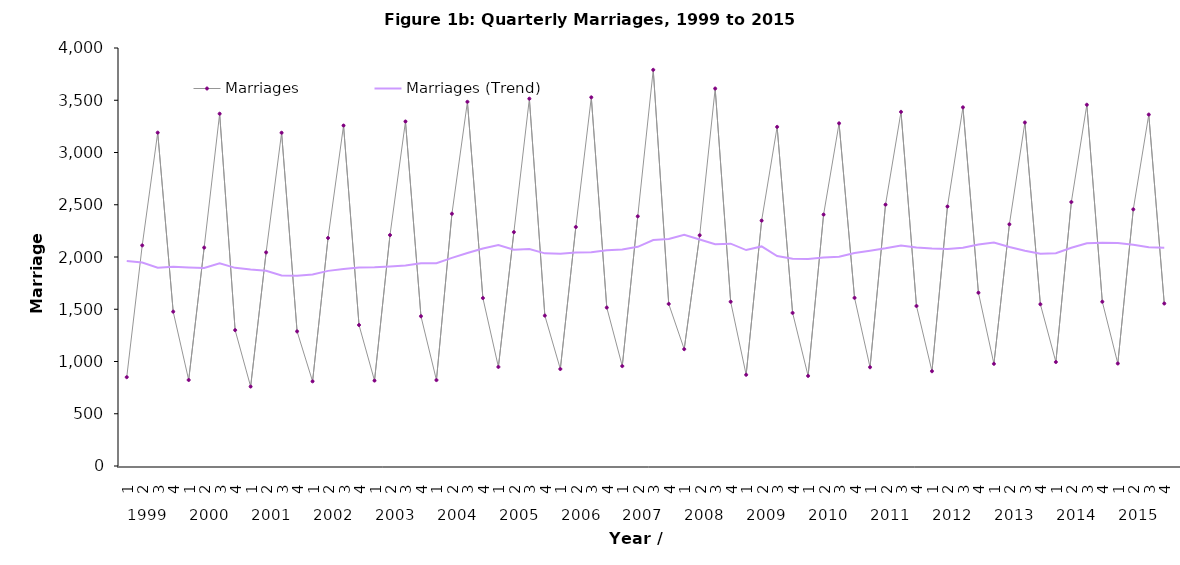
| Category | Marriages | Marriages (Trend) |
|---|---|---|
| 0 | 850 | 1961.25 |
| 1 | 2111 | 1946.75 |
| 2 | 3190 | 1898.25 |
| 3 | 1477 | 1907 |
| 4 | 823 | 1900.25 |
| 5 | 2090 | 1895 |
| 6 | 3371 | 1940.25 |
| 7 | 1300 | 1896 |
| 8 | 760 | 1880.25 |
| 9 | 2044 | 1868.75 |
| 10 | 3189 | 1823.25 |
| 11 | 1288 | 1820.25 |
| 12 | 810 | 1832.75 |
| 13 | 2182 | 1867.25 |
| 14 | 3258 | 1884.5 |
| 15 | 1349 | 1899.75 |
| 16 | 817 | 1901.5 |
| 17 | 2210 | 1908.5 |
| 18 | 3297 | 1918.25 |
| 19 | 1433 | 1939.25 |
| 20 | 822 | 1940.5 |
| 21 | 2414 | 1991.5 |
| 22 | 3485 | 2038.5 |
| 23 | 1607 | 2082 |
| 24 | 948 | 2113.5 |
| 25 | 2238 | 2069.5 |
| 26 | 3515 | 2077 |
| 27 | 1439 | 2035 |
| 28 | 928 | 2030 |
| 29 | 2287 | 2042.25 |
| 30 | 3528 | 2045.5 |
| 31 | 1516 | 2064.75 |
| 32 | 956 | 2071.75 |
| 33 | 2389 | 2097.25 |
| 34 | 3791 | 2163 |
| 35 | 1551 | 2171.75 |
| 36 | 1118 | 2212.25 |
| 37 | 2208 | 2167 |
| 38 | 3612 | 2122.25 |
| 39 | 1572 | 2127.5 |
| 40 | 873 | 2066.25 |
| 41 | 2348 | 2101.25 |
| 42 | 3245 | 2009.5 |
| 43 | 1465 | 1982.75 |
| 44 | 862 | 1980 |
| 45 | 2406 | 1994.5 |
| 46 | 3279 | 2003 |
| 47 | 1609 | 2039 |
| 48 | 945 | 2059.75 |
| 49 | 2501 | 2083.5 |
| 50 | 3389 | 2111 |
| 51 | 1531 | 2091.5 |
| 52 | 907 | 2082 |
| 53 | 2483 | 2077.5 |
| 54 | 3432 | 2088.25 |
| 55 | 1658 | 2120 |
| 56 | 978 | 2137.75 |
| 57 | 2313 | 2095.25 |
| 58 | 3287 | 2059 |
| 59 | 1548 | 2031.5 |
| 60 | 995 | 2035.75 |
| 61 | 2526 | 2089 |
| 62 | 3457 | 2131.5 |
| 63 | 1572 | 2137.5 |
| 64 | 981 | 2134 |
| 65 | 2456 | 2116.5 |
| 66 | 3363 | 2093 |
| 67 | 1555 | 2088.75 |